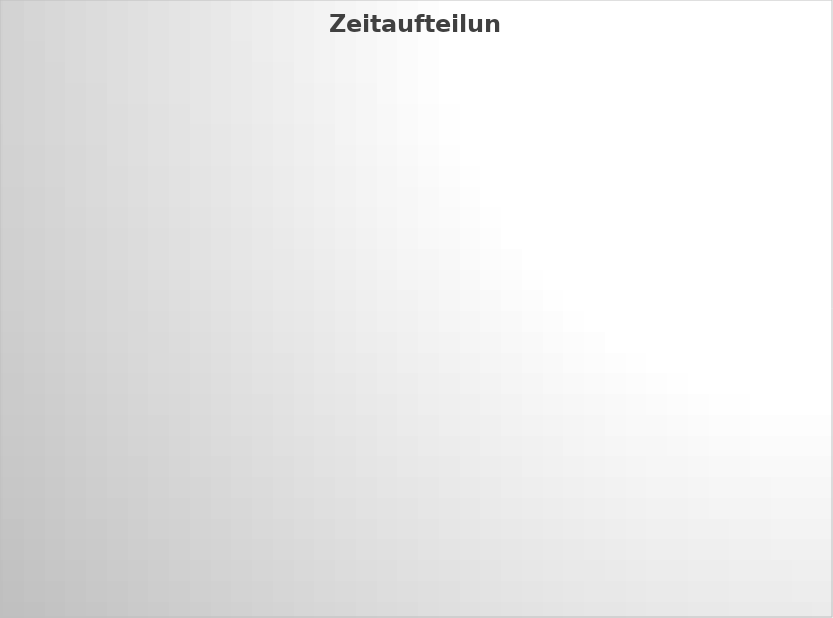
| Category | Weiterbildung |
|---|---|
| Weiterbildung | 0 |
| Essen | 0 |
| Freizeit | 0 |
| Business | 0 |
| Familie | 0 |
| Hausaufgaben | 0 |
| Schlafen | 0 |
| Arbeit | 0 |